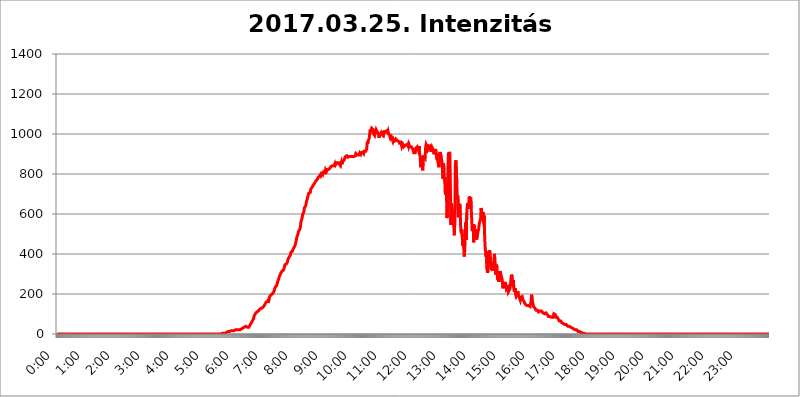
| Category | 2017.03.25. Intenzitás [W/m^2] |
|---|---|
| 0.0 | 0 |
| 0.0006944444444444445 | 0 |
| 0.001388888888888889 | 0 |
| 0.0020833333333333333 | 0 |
| 0.002777777777777778 | 0 |
| 0.003472222222222222 | 0 |
| 0.004166666666666667 | 0 |
| 0.004861111111111111 | 0 |
| 0.005555555555555556 | 0 |
| 0.0062499999999999995 | 0 |
| 0.006944444444444444 | 0 |
| 0.007638888888888889 | 0 |
| 0.008333333333333333 | 0 |
| 0.009027777777777779 | 0 |
| 0.009722222222222222 | 0 |
| 0.010416666666666666 | 0 |
| 0.011111111111111112 | 0 |
| 0.011805555555555555 | 0 |
| 0.012499999999999999 | 0 |
| 0.013194444444444444 | 0 |
| 0.013888888888888888 | 0 |
| 0.014583333333333332 | 0 |
| 0.015277777777777777 | 0 |
| 0.015972222222222224 | 0 |
| 0.016666666666666666 | 0 |
| 0.017361111111111112 | 0 |
| 0.018055555555555557 | 0 |
| 0.01875 | 0 |
| 0.019444444444444445 | 0 |
| 0.02013888888888889 | 0 |
| 0.020833333333333332 | 0 |
| 0.02152777777777778 | 0 |
| 0.022222222222222223 | 0 |
| 0.02291666666666667 | 0 |
| 0.02361111111111111 | 0 |
| 0.024305555555555556 | 0 |
| 0.024999999999999998 | 0 |
| 0.025694444444444447 | 0 |
| 0.02638888888888889 | 0 |
| 0.027083333333333334 | 0 |
| 0.027777777777777776 | 0 |
| 0.02847222222222222 | 0 |
| 0.029166666666666664 | 0 |
| 0.029861111111111113 | 0 |
| 0.030555555555555555 | 0 |
| 0.03125 | 0 |
| 0.03194444444444445 | 0 |
| 0.03263888888888889 | 0 |
| 0.03333333333333333 | 0 |
| 0.034027777777777775 | 0 |
| 0.034722222222222224 | 0 |
| 0.035416666666666666 | 0 |
| 0.036111111111111115 | 0 |
| 0.03680555555555556 | 0 |
| 0.0375 | 0 |
| 0.03819444444444444 | 0 |
| 0.03888888888888889 | 0 |
| 0.03958333333333333 | 0 |
| 0.04027777777777778 | 0 |
| 0.04097222222222222 | 0 |
| 0.041666666666666664 | 0 |
| 0.042361111111111106 | 0 |
| 0.04305555555555556 | 0 |
| 0.043750000000000004 | 0 |
| 0.044444444444444446 | 0 |
| 0.04513888888888889 | 0 |
| 0.04583333333333334 | 0 |
| 0.04652777777777778 | 0 |
| 0.04722222222222222 | 0 |
| 0.04791666666666666 | 0 |
| 0.04861111111111111 | 0 |
| 0.049305555555555554 | 0 |
| 0.049999999999999996 | 0 |
| 0.05069444444444445 | 0 |
| 0.051388888888888894 | 0 |
| 0.052083333333333336 | 0 |
| 0.05277777777777778 | 0 |
| 0.05347222222222222 | 0 |
| 0.05416666666666667 | 0 |
| 0.05486111111111111 | 0 |
| 0.05555555555555555 | 0 |
| 0.05625 | 0 |
| 0.05694444444444444 | 0 |
| 0.057638888888888885 | 0 |
| 0.05833333333333333 | 0 |
| 0.05902777777777778 | 0 |
| 0.059722222222222225 | 0 |
| 0.06041666666666667 | 0 |
| 0.061111111111111116 | 0 |
| 0.06180555555555556 | 0 |
| 0.0625 | 0 |
| 0.06319444444444444 | 0 |
| 0.06388888888888888 | 0 |
| 0.06458333333333334 | 0 |
| 0.06527777777777778 | 0 |
| 0.06597222222222222 | 0 |
| 0.06666666666666667 | 0 |
| 0.06736111111111111 | 0 |
| 0.06805555555555555 | 0 |
| 0.06874999999999999 | 0 |
| 0.06944444444444443 | 0 |
| 0.07013888888888889 | 0 |
| 0.07083333333333333 | 0 |
| 0.07152777777777779 | 0 |
| 0.07222222222222223 | 0 |
| 0.07291666666666667 | 0 |
| 0.07361111111111111 | 0 |
| 0.07430555555555556 | 0 |
| 0.075 | 0 |
| 0.07569444444444444 | 0 |
| 0.0763888888888889 | 0 |
| 0.07708333333333334 | 0 |
| 0.07777777777777778 | 0 |
| 0.07847222222222222 | 0 |
| 0.07916666666666666 | 0 |
| 0.0798611111111111 | 0 |
| 0.08055555555555556 | 0 |
| 0.08125 | 0 |
| 0.08194444444444444 | 0 |
| 0.08263888888888889 | 0 |
| 0.08333333333333333 | 0 |
| 0.08402777777777777 | 0 |
| 0.08472222222222221 | 0 |
| 0.08541666666666665 | 0 |
| 0.08611111111111112 | 0 |
| 0.08680555555555557 | 0 |
| 0.08750000000000001 | 0 |
| 0.08819444444444445 | 0 |
| 0.08888888888888889 | 0 |
| 0.08958333333333333 | 0 |
| 0.09027777777777778 | 0 |
| 0.09097222222222222 | 0 |
| 0.09166666666666667 | 0 |
| 0.09236111111111112 | 0 |
| 0.09305555555555556 | 0 |
| 0.09375 | 0 |
| 0.09444444444444444 | 0 |
| 0.09513888888888888 | 0 |
| 0.09583333333333333 | 0 |
| 0.09652777777777777 | 0 |
| 0.09722222222222222 | 0 |
| 0.09791666666666667 | 0 |
| 0.09861111111111111 | 0 |
| 0.09930555555555555 | 0 |
| 0.09999999999999999 | 0 |
| 0.10069444444444443 | 0 |
| 0.1013888888888889 | 0 |
| 0.10208333333333335 | 0 |
| 0.10277777777777779 | 0 |
| 0.10347222222222223 | 0 |
| 0.10416666666666667 | 0 |
| 0.10486111111111111 | 0 |
| 0.10555555555555556 | 0 |
| 0.10625 | 0 |
| 0.10694444444444444 | 0 |
| 0.1076388888888889 | 0 |
| 0.10833333333333334 | 0 |
| 0.10902777777777778 | 0 |
| 0.10972222222222222 | 0 |
| 0.1111111111111111 | 0 |
| 0.11180555555555556 | 0 |
| 0.11180555555555556 | 0 |
| 0.1125 | 0 |
| 0.11319444444444444 | 0 |
| 0.11388888888888889 | 0 |
| 0.11458333333333333 | 0 |
| 0.11527777777777777 | 0 |
| 0.11597222222222221 | 0 |
| 0.11666666666666665 | 0 |
| 0.1173611111111111 | 0 |
| 0.11805555555555557 | 0 |
| 0.11944444444444445 | 0 |
| 0.12013888888888889 | 0 |
| 0.12083333333333333 | 0 |
| 0.12152777777777778 | 0 |
| 0.12222222222222223 | 0 |
| 0.12291666666666667 | 0 |
| 0.12291666666666667 | 0 |
| 0.12361111111111112 | 0 |
| 0.12430555555555556 | 0 |
| 0.125 | 0 |
| 0.12569444444444444 | 0 |
| 0.12638888888888888 | 0 |
| 0.12708333333333333 | 0 |
| 0.16875 | 0 |
| 0.12847222222222224 | 0 |
| 0.12916666666666668 | 0 |
| 0.12986111111111112 | 0 |
| 0.13055555555555556 | 0 |
| 0.13125 | 0 |
| 0.13194444444444445 | 0 |
| 0.1326388888888889 | 0 |
| 0.13333333333333333 | 0 |
| 0.13402777777777777 | 0 |
| 0.13402777777777777 | 0 |
| 0.13472222222222222 | 0 |
| 0.13541666666666666 | 0 |
| 0.1361111111111111 | 0 |
| 0.13749999999999998 | 0 |
| 0.13819444444444443 | 0 |
| 0.1388888888888889 | 0 |
| 0.13958333333333334 | 0 |
| 0.14027777777777778 | 0 |
| 0.14097222222222222 | 0 |
| 0.14166666666666666 | 0 |
| 0.1423611111111111 | 0 |
| 0.14305555555555557 | 0 |
| 0.14375000000000002 | 0 |
| 0.14444444444444446 | 0 |
| 0.1451388888888889 | 0 |
| 0.1451388888888889 | 0 |
| 0.14652777777777778 | 0 |
| 0.14722222222222223 | 0 |
| 0.14791666666666667 | 0 |
| 0.1486111111111111 | 0 |
| 0.14930555555555555 | 0 |
| 0.15 | 0 |
| 0.15069444444444444 | 0 |
| 0.15138888888888888 | 0 |
| 0.15208333333333332 | 0 |
| 0.15277777777777776 | 0 |
| 0.15347222222222223 | 0 |
| 0.15416666666666667 | 0 |
| 0.15486111111111112 | 0 |
| 0.15555555555555556 | 0 |
| 0.15625 | 0 |
| 0.15694444444444444 | 0 |
| 0.15763888888888888 | 0 |
| 0.15833333333333333 | 0 |
| 0.15902777777777777 | 0 |
| 0.15972222222222224 | 0 |
| 0.16041666666666668 | 0 |
| 0.16111111111111112 | 0 |
| 0.16180555555555556 | 0 |
| 0.1625 | 0 |
| 0.16319444444444445 | 0 |
| 0.1638888888888889 | 0 |
| 0.16458333333333333 | 0 |
| 0.16527777777777777 | 0 |
| 0.16597222222222222 | 0 |
| 0.16666666666666666 | 0 |
| 0.1673611111111111 | 0 |
| 0.16805555555555554 | 0 |
| 0.16874999999999998 | 0 |
| 0.16944444444444443 | 0 |
| 0.17013888888888887 | 0 |
| 0.1708333333333333 | 0 |
| 0.17152777777777775 | 0 |
| 0.17222222222222225 | 0 |
| 0.1729166666666667 | 0 |
| 0.17361111111111113 | 0 |
| 0.17430555555555557 | 0 |
| 0.17500000000000002 | 0 |
| 0.17569444444444446 | 0 |
| 0.1763888888888889 | 0 |
| 0.17708333333333334 | 0 |
| 0.17777777777777778 | 0 |
| 0.17847222222222223 | 0 |
| 0.17916666666666667 | 0 |
| 0.1798611111111111 | 0 |
| 0.18055555555555555 | 0 |
| 0.18125 | 0 |
| 0.18194444444444444 | 0 |
| 0.1826388888888889 | 0 |
| 0.18333333333333335 | 0 |
| 0.1840277777777778 | 0 |
| 0.18472222222222223 | 0 |
| 0.18541666666666667 | 0 |
| 0.18611111111111112 | 0 |
| 0.18680555555555556 | 0 |
| 0.1875 | 0 |
| 0.18819444444444444 | 0 |
| 0.18888888888888888 | 0 |
| 0.18958333333333333 | 0 |
| 0.19027777777777777 | 0 |
| 0.1909722222222222 | 0 |
| 0.19166666666666665 | 0 |
| 0.19236111111111112 | 0 |
| 0.19305555555555554 | 0 |
| 0.19375 | 0 |
| 0.19444444444444445 | 0 |
| 0.1951388888888889 | 0 |
| 0.19583333333333333 | 0 |
| 0.19652777777777777 | 0 |
| 0.19722222222222222 | 0 |
| 0.19791666666666666 | 0 |
| 0.1986111111111111 | 0 |
| 0.19930555555555554 | 0 |
| 0.19999999999999998 | 0 |
| 0.20069444444444443 | 0 |
| 0.20138888888888887 | 0 |
| 0.2020833333333333 | 0 |
| 0.2027777777777778 | 0 |
| 0.2034722222222222 | 0 |
| 0.2041666666666667 | 0 |
| 0.20486111111111113 | 0 |
| 0.20555555555555557 | 0 |
| 0.20625000000000002 | 0 |
| 0.20694444444444446 | 0 |
| 0.2076388888888889 | 0 |
| 0.20833333333333334 | 0 |
| 0.20902777777777778 | 0 |
| 0.20972222222222223 | 0 |
| 0.21041666666666667 | 0 |
| 0.2111111111111111 | 0 |
| 0.21180555555555555 | 0 |
| 0.2125 | 0 |
| 0.21319444444444444 | 0 |
| 0.2138888888888889 | 0 |
| 0.21458333333333335 | 0 |
| 0.2152777777777778 | 0 |
| 0.21597222222222223 | 0 |
| 0.21666666666666667 | 0 |
| 0.21736111111111112 | 0 |
| 0.21805555555555556 | 0 |
| 0.21875 | 0 |
| 0.21944444444444444 | 0 |
| 0.22013888888888888 | 0 |
| 0.22083333333333333 | 0 |
| 0.22152777777777777 | 0 |
| 0.2222222222222222 | 0 |
| 0.22291666666666665 | 0 |
| 0.2236111111111111 | 0 |
| 0.22430555555555556 | 0 |
| 0.225 | 0 |
| 0.22569444444444445 | 0 |
| 0.2263888888888889 | 0 |
| 0.22708333333333333 | 0 |
| 0.22777777777777777 | 0 |
| 0.22847222222222222 | 0 |
| 0.22916666666666666 | 0 |
| 0.2298611111111111 | 0 |
| 0.23055555555555554 | 0 |
| 0.23124999999999998 | 3.525 |
| 0.23194444444444443 | 3.525 |
| 0.23263888888888887 | 3.525 |
| 0.2333333333333333 | 3.525 |
| 0.2340277777777778 | 3.525 |
| 0.2347222222222222 | 3.525 |
| 0.2354166666666667 | 3.525 |
| 0.23611111111111113 | 7.887 |
| 0.23680555555555557 | 7.887 |
| 0.23750000000000002 | 7.887 |
| 0.23819444444444446 | 12.257 |
| 0.2388888888888889 | 12.257 |
| 0.23958333333333334 | 12.257 |
| 0.24027777777777778 | 12.257 |
| 0.24097222222222223 | 12.257 |
| 0.24166666666666667 | 12.257 |
| 0.2423611111111111 | 16.636 |
| 0.24305555555555555 | 16.636 |
| 0.24375 | 16.636 |
| 0.24444444444444446 | 16.636 |
| 0.24513888888888888 | 16.636 |
| 0.24583333333333335 | 16.636 |
| 0.2465277777777778 | 16.636 |
| 0.24722222222222223 | 16.636 |
| 0.24791666666666667 | 16.636 |
| 0.24861111111111112 | 21.024 |
| 0.24930555555555556 | 21.024 |
| 0.25 | 21.024 |
| 0.25069444444444444 | 21.024 |
| 0.2513888888888889 | 21.024 |
| 0.2520833333333333 | 21.024 |
| 0.25277777777777777 | 21.024 |
| 0.2534722222222222 | 21.024 |
| 0.25416666666666665 | 21.024 |
| 0.2548611111111111 | 21.024 |
| 0.2555555555555556 | 21.024 |
| 0.25625000000000003 | 21.024 |
| 0.2569444444444445 | 21.024 |
| 0.2576388888888889 | 25.419 |
| 0.25833333333333336 | 25.419 |
| 0.2590277777777778 | 25.419 |
| 0.25972222222222224 | 25.419 |
| 0.2604166666666667 | 29.823 |
| 0.2611111111111111 | 29.823 |
| 0.26180555555555557 | 34.234 |
| 0.2625 | 34.234 |
| 0.26319444444444445 | 38.653 |
| 0.2638888888888889 | 38.653 |
| 0.26458333333333334 | 38.653 |
| 0.2652777777777778 | 34.234 |
| 0.2659722222222222 | 34.234 |
| 0.26666666666666666 | 34.234 |
| 0.2673611111111111 | 34.234 |
| 0.26805555555555555 | 34.234 |
| 0.26875 | 34.234 |
| 0.26944444444444443 | 38.653 |
| 0.2701388888888889 | 43.079 |
| 0.2708333333333333 | 47.511 |
| 0.27152777777777776 | 51.951 |
| 0.2722222222222222 | 56.398 |
| 0.27291666666666664 | 60.85 |
| 0.2736111111111111 | 60.85 |
| 0.2743055555555555 | 65.31 |
| 0.27499999999999997 | 74.246 |
| 0.27569444444444446 | 74.246 |
| 0.27638888888888885 | 92.184 |
| 0.27708333333333335 | 92.184 |
| 0.2777777777777778 | 101.184 |
| 0.27847222222222223 | 105.69 |
| 0.2791666666666667 | 105.69 |
| 0.2798611111111111 | 110.201 |
| 0.28055555555555556 | 110.201 |
| 0.28125 | 114.716 |
| 0.28194444444444444 | 114.716 |
| 0.2826388888888889 | 119.235 |
| 0.2833333333333333 | 119.235 |
| 0.28402777777777777 | 123.758 |
| 0.2847222222222222 | 123.758 |
| 0.28541666666666665 | 128.284 |
| 0.28611111111111115 | 128.284 |
| 0.28680555555555554 | 128.284 |
| 0.28750000000000003 | 132.814 |
| 0.2881944444444445 | 132.814 |
| 0.2888888888888889 | 137.347 |
| 0.28958333333333336 | 137.347 |
| 0.2902777777777778 | 141.884 |
| 0.29097222222222224 | 146.423 |
| 0.2916666666666667 | 150.964 |
| 0.2923611111111111 | 155.509 |
| 0.29305555555555557 | 160.056 |
| 0.29375 | 164.605 |
| 0.29444444444444445 | 164.605 |
| 0.2951388888888889 | 164.605 |
| 0.29583333333333334 | 155.509 |
| 0.2965277777777778 | 160.056 |
| 0.2972222222222222 | 178.264 |
| 0.29791666666666666 | 187.378 |
| 0.2986111111111111 | 187.378 |
| 0.29930555555555555 | 191.937 |
| 0.3 | 196.497 |
| 0.30069444444444443 | 196.497 |
| 0.3013888888888889 | 201.058 |
| 0.3020833333333333 | 201.058 |
| 0.30277777777777776 | 201.058 |
| 0.3034722222222222 | 205.62 |
| 0.30416666666666664 | 214.746 |
| 0.3048611111111111 | 223.873 |
| 0.3055555555555555 | 233 |
| 0.30624999999999997 | 237.564 |
| 0.3069444444444444 | 237.564 |
| 0.3076388888888889 | 242.127 |
| 0.30833333333333335 | 242.127 |
| 0.3090277777777778 | 260.373 |
| 0.30972222222222223 | 264.932 |
| 0.3104166666666667 | 274.047 |
| 0.3111111111111111 | 283.156 |
| 0.31180555555555556 | 287.709 |
| 0.3125 | 296.808 |
| 0.31319444444444444 | 296.808 |
| 0.3138888888888889 | 305.898 |
| 0.3145833333333333 | 310.44 |
| 0.31527777777777777 | 314.98 |
| 0.3159722222222222 | 314.98 |
| 0.31666666666666665 | 314.98 |
| 0.31736111111111115 | 319.517 |
| 0.31805555555555554 | 324.052 |
| 0.31875000000000003 | 337.639 |
| 0.3194444444444445 | 346.682 |
| 0.3201388888888889 | 342.162 |
| 0.32083333333333336 | 346.682 |
| 0.3215277777777778 | 351.198 |
| 0.32222222222222224 | 355.712 |
| 0.3229166666666667 | 360.221 |
| 0.3236111111111111 | 373.729 |
| 0.32430555555555557 | 373.729 |
| 0.325 | 373.729 |
| 0.32569444444444445 | 387.202 |
| 0.3263888888888889 | 387.202 |
| 0.32708333333333334 | 396.164 |
| 0.3277777777777778 | 409.574 |
| 0.3284722222222222 | 405.108 |
| 0.32916666666666666 | 409.574 |
| 0.3298611111111111 | 414.035 |
| 0.33055555555555555 | 422.943 |
| 0.33125 | 418.492 |
| 0.33194444444444443 | 431.833 |
| 0.3326388888888889 | 436.27 |
| 0.3333333333333333 | 440.702 |
| 0.3340277777777778 | 449.551 |
| 0.3347222222222222 | 453.968 |
| 0.3354166666666667 | 471.582 |
| 0.3361111111111111 | 484.735 |
| 0.3368055555555556 | 484.735 |
| 0.33749999999999997 | 497.836 |
| 0.33819444444444446 | 510.885 |
| 0.33888888888888885 | 506.542 |
| 0.33958333333333335 | 519.555 |
| 0.34027777777777773 | 523.88 |
| 0.34097222222222223 | 532.513 |
| 0.3416666666666666 | 558.261 |
| 0.3423611111111111 | 566.793 |
| 0.3430555555555555 | 575.299 |
| 0.34375 | 579.542 |
| 0.3444444444444445 | 600.661 |
| 0.3451388888888889 | 604.864 |
| 0.3458333333333334 | 609.062 |
| 0.34652777777777777 | 629.948 |
| 0.34722222222222227 | 634.105 |
| 0.34791666666666665 | 629.948 |
| 0.34861111111111115 | 642.4 |
| 0.34930555555555554 | 658.909 |
| 0.35000000000000003 | 658.909 |
| 0.3506944444444444 | 675.311 |
| 0.3513888888888889 | 687.544 |
| 0.3520833333333333 | 695.666 |
| 0.3527777777777778 | 703.762 |
| 0.3534722222222222 | 703.762 |
| 0.3541666666666667 | 707.8 |
| 0.3548611111111111 | 707.8 |
| 0.35555555555555557 | 723.889 |
| 0.35625 | 723.889 |
| 0.35694444444444445 | 727.896 |
| 0.3576388888888889 | 735.89 |
| 0.35833333333333334 | 731.896 |
| 0.3590277777777778 | 743.859 |
| 0.3597222222222222 | 747.834 |
| 0.36041666666666666 | 747.834 |
| 0.3611111111111111 | 755.766 |
| 0.36180555555555555 | 751.803 |
| 0.3625 | 759.723 |
| 0.36319444444444443 | 767.62 |
| 0.3638888888888889 | 767.62 |
| 0.3645833333333333 | 767.62 |
| 0.3652777777777778 | 775.492 |
| 0.3659722222222222 | 783.342 |
| 0.3666666666666667 | 783.342 |
| 0.3673611111111111 | 787.258 |
| 0.3680555555555556 | 791.169 |
| 0.36874999999999997 | 795.074 |
| 0.36944444444444446 | 798.974 |
| 0.37013888888888885 | 791.169 |
| 0.37083333333333335 | 791.169 |
| 0.37152777777777773 | 798.974 |
| 0.37222222222222223 | 810.641 |
| 0.3729166666666666 | 802.868 |
| 0.3736111111111111 | 810.641 |
| 0.3743055555555555 | 806.757 |
| 0.375 | 810.641 |
| 0.3756944444444445 | 806.757 |
| 0.3763888888888889 | 822.26 |
| 0.3770833333333334 | 818.392 |
| 0.37777777777777777 | 814.519 |
| 0.37847222222222227 | 822.26 |
| 0.37916666666666665 | 822.26 |
| 0.37986111111111115 | 826.123 |
| 0.38055555555555554 | 822.26 |
| 0.38125000000000003 | 818.392 |
| 0.3819444444444444 | 826.123 |
| 0.3826388888888889 | 829.981 |
| 0.3833333333333333 | 829.981 |
| 0.3840277777777778 | 837.682 |
| 0.3847222222222222 | 833.834 |
| 0.3854166666666667 | 837.682 |
| 0.3861111111111111 | 841.526 |
| 0.38680555555555557 | 845.365 |
| 0.3875 | 837.682 |
| 0.38819444444444445 | 841.526 |
| 0.3888888888888889 | 845.365 |
| 0.38958333333333334 | 853.029 |
| 0.3902777777777778 | 845.365 |
| 0.3909722222222222 | 849.199 |
| 0.39166666666666666 | 849.199 |
| 0.3923611111111111 | 856.855 |
| 0.39305555555555555 | 860.676 |
| 0.39375 | 860.676 |
| 0.39444444444444443 | 856.855 |
| 0.3951388888888889 | 853.029 |
| 0.3958333333333333 | 849.199 |
| 0.3965277777777778 | 849.199 |
| 0.3972222222222222 | 841.526 |
| 0.3979166666666667 | 853.029 |
| 0.3986111111111111 | 860.676 |
| 0.3993055555555556 | 849.199 |
| 0.39999999999999997 | 860.676 |
| 0.40069444444444446 | 860.676 |
| 0.40138888888888885 | 864.493 |
| 0.40208333333333335 | 868.305 |
| 0.40277777777777773 | 875.918 |
| 0.40347222222222223 | 875.918 |
| 0.4041666666666666 | 887.309 |
| 0.4048611111111111 | 883.516 |
| 0.4055555555555555 | 887.309 |
| 0.40625 | 891.099 |
| 0.4069444444444445 | 887.309 |
| 0.4076388888888889 | 883.516 |
| 0.4083333333333334 | 887.309 |
| 0.40902777777777777 | 887.309 |
| 0.40972222222222227 | 887.309 |
| 0.41041666666666665 | 883.516 |
| 0.41111111111111115 | 887.309 |
| 0.41180555555555554 | 887.309 |
| 0.41250000000000003 | 891.099 |
| 0.4131944444444444 | 891.099 |
| 0.4138888888888889 | 887.309 |
| 0.4145833333333333 | 891.099 |
| 0.4152777777777778 | 891.099 |
| 0.4159722222222222 | 887.309 |
| 0.4166666666666667 | 887.309 |
| 0.4173611111111111 | 883.516 |
| 0.41805555555555557 | 891.099 |
| 0.41875 | 902.447 |
| 0.41944444444444445 | 898.668 |
| 0.4201388888888889 | 902.447 |
| 0.42083333333333334 | 894.885 |
| 0.4215277777777778 | 898.668 |
| 0.4222222222222222 | 894.885 |
| 0.42291666666666666 | 894.885 |
| 0.4236111111111111 | 894.885 |
| 0.42430555555555555 | 906.223 |
| 0.425 | 909.996 |
| 0.42569444444444443 | 898.668 |
| 0.4263888888888889 | 906.223 |
| 0.4270833333333333 | 909.996 |
| 0.4277777777777778 | 909.996 |
| 0.4284722222222222 | 909.996 |
| 0.4291666666666667 | 913.766 |
| 0.4298611111111111 | 902.447 |
| 0.4305555555555556 | 913.766 |
| 0.43124999999999997 | 909.996 |
| 0.43194444444444446 | 909.996 |
| 0.43263888888888885 | 913.766 |
| 0.43333333333333335 | 909.996 |
| 0.43402777777777773 | 925.06 |
| 0.43472222222222223 | 958.814 |
| 0.4354166666666666 | 951.327 |
| 0.4361111111111111 | 966.295 |
| 0.4368055555555555 | 970.034 |
| 0.4375 | 977.508 |
| 0.4381944444444445 | 999.916 |
| 0.4388888888888889 | 1022.323 |
| 0.4395833333333334 | 1014.852 |
| 0.44027777777777777 | 1018.587 |
| 0.44097222222222227 | 1029.798 |
| 0.44166666666666665 | 1033.537 |
| 0.44236111111111115 | 1026.06 |
| 0.44305555555555554 | 1022.323 |
| 0.44375000000000003 | 999.916 |
| 0.4444444444444444 | 999.916 |
| 0.4451388888888889 | 992.448 |
| 0.4458333333333333 | 1003.65 |
| 0.4465277777777778 | 1003.65 |
| 0.4472222222222222 | 1022.323 |
| 0.4479166666666667 | 1022.323 |
| 0.4486111111111111 | 1022.323 |
| 0.44930555555555557 | 1007.383 |
| 0.45 | 1007.383 |
| 0.45069444444444445 | 996.182 |
| 0.4513888888888889 | 981.244 |
| 0.45208333333333334 | 992.448 |
| 0.4527777777777778 | 999.916 |
| 0.4534722222222222 | 1003.65 |
| 0.45416666666666666 | 1007.383 |
| 0.4548611111111111 | 999.916 |
| 0.45555555555555555 | 1003.65 |
| 0.45625 | 999.916 |
| 0.45694444444444443 | 992.448 |
| 0.4576388888888889 | 1014.852 |
| 0.4583333333333333 | 1007.383 |
| 0.4590277777777778 | 1018.587 |
| 0.4597222222222222 | 1007.383 |
| 0.4604166666666667 | 1007.383 |
| 0.4611111111111111 | 1003.65 |
| 0.4618055555555556 | 1014.852 |
| 0.46249999999999997 | 1014.852 |
| 0.46319444444444446 | 1007.383 |
| 0.46388888888888885 | 1014.852 |
| 0.46458333333333335 | 1003.65 |
| 0.46527777777777773 | 999.916 |
| 0.46597222222222223 | 996.182 |
| 0.4666666666666666 | 984.98 |
| 0.4673611111111111 | 977.508 |
| 0.4680555555555555 | 981.244 |
| 0.46875 | 984.98 |
| 0.4694444444444445 | 981.244 |
| 0.4701388888888889 | 970.034 |
| 0.4708333333333334 | 962.555 |
| 0.47152777777777777 | 970.034 |
| 0.47222222222222227 | 962.555 |
| 0.47291666666666665 | 966.295 |
| 0.47361111111111115 | 958.814 |
| 0.47430555555555554 | 966.295 |
| 0.47500000000000003 | 973.772 |
| 0.4756944444444444 | 970.034 |
| 0.4763888888888889 | 970.034 |
| 0.4770833333333333 | 966.295 |
| 0.4777777777777778 | 970.034 |
| 0.4784722222222222 | 970.034 |
| 0.4791666666666667 | 962.555 |
| 0.4798611111111111 | 955.071 |
| 0.48055555555555557 | 958.814 |
| 0.48125 | 958.814 |
| 0.48194444444444445 | 958.814 |
| 0.4826388888888889 | 947.58 |
| 0.48333333333333334 | 936.33 |
| 0.4840277777777778 | 936.33 |
| 0.4847222222222222 | 947.58 |
| 0.48541666666666666 | 947.58 |
| 0.4861111111111111 | 936.33 |
| 0.48680555555555555 | 932.576 |
| 0.4875 | 932.576 |
| 0.48819444444444443 | 943.832 |
| 0.4888888888888889 | 940.082 |
| 0.4895833333333333 | 940.082 |
| 0.4902777777777778 | 947.58 |
| 0.4909722222222222 | 947.58 |
| 0.4916666666666667 | 940.082 |
| 0.4923611111111111 | 947.58 |
| 0.4930555555555556 | 936.33 |
| 0.49374999999999997 | 943.832 |
| 0.49444444444444446 | 936.33 |
| 0.49513888888888885 | 940.082 |
| 0.49583333333333335 | 940.082 |
| 0.49652777777777773 | 936.33 |
| 0.49722222222222223 | 936.33 |
| 0.4979166666666666 | 932.576 |
| 0.4986111111111111 | 925.06 |
| 0.4993055555555555 | 917.534 |
| 0.5 | 906.223 |
| 0.5006944444444444 | 902.447 |
| 0.5013888888888889 | 906.223 |
| 0.5020833333333333 | 906.223 |
| 0.5027777777777778 | 928.819 |
| 0.5034722222222222 | 928.819 |
| 0.5041666666666667 | 928.819 |
| 0.5048611111111111 | 936.33 |
| 0.5055555555555555 | 940.082 |
| 0.50625 | 921.298 |
| 0.5069444444444444 | 921.298 |
| 0.5076388888888889 | 940.082 |
| 0.5083333333333333 | 894.885 |
| 0.5090277777777777 | 887.309 |
| 0.5097222222222222 | 833.834 |
| 0.5104166666666666 | 875.918 |
| 0.5111111111111112 | 887.309 |
| 0.5118055555555555 | 887.309 |
| 0.5125000000000001 | 818.392 |
| 0.5131944444444444 | 868.305 |
| 0.513888888888889 | 894.885 |
| 0.5145833333333333 | 887.309 |
| 0.5152777777777778 | 883.516 |
| 0.5159722222222222 | 879.719 |
| 0.5166666666666667 | 932.576 |
| 0.517361111111111 | 947.58 |
| 0.5180555555555556 | 947.58 |
| 0.5187499999999999 | 936.33 |
| 0.5194444444444445 | 947.58 |
| 0.5201388888888888 | 921.298 |
| 0.5208333333333334 | 921.298 |
| 0.5215277777777778 | 928.819 |
| 0.5222222222222223 | 932.576 |
| 0.5229166666666667 | 936.33 |
| 0.5236111111111111 | 928.819 |
| 0.5243055555555556 | 909.996 |
| 0.525 | 909.996 |
| 0.5256944444444445 | 932.576 |
| 0.5263888888888889 | 932.576 |
| 0.5270833333333333 | 921.298 |
| 0.5277777777777778 | 917.534 |
| 0.5284722222222222 | 898.668 |
| 0.5291666666666667 | 894.885 |
| 0.5298611111111111 | 917.534 |
| 0.5305555555555556 | 925.06 |
| 0.53125 | 925.06 |
| 0.5319444444444444 | 891.099 |
| 0.5326388888888889 | 872.114 |
| 0.5333333333333333 | 887.309 |
| 0.5340277777777778 | 860.676 |
| 0.5347222222222222 | 856.855 |
| 0.5354166666666667 | 833.834 |
| 0.5361111111111111 | 898.668 |
| 0.5368055555555555 | 909.996 |
| 0.5375 | 909.996 |
| 0.5381944444444444 | 891.099 |
| 0.5388888888888889 | 879.719 |
| 0.5395833333333333 | 860.676 |
| 0.5402777777777777 | 822.26 |
| 0.5409722222222222 | 775.492 |
| 0.5416666666666666 | 853.029 |
| 0.5423611111111112 | 826.123 |
| 0.5430555555555555 | 767.62 |
| 0.5437500000000001 | 783.342 |
| 0.5444444444444444 | 695.666 |
| 0.545138888888889 | 751.803 |
| 0.5458333333333333 | 719.877 |
| 0.5465277777777778 | 579.542 |
| 0.5472222222222222 | 604.864 |
| 0.5479166666666667 | 818.392 |
| 0.548611111111111 | 906.223 |
| 0.5493055555555556 | 891.099 |
| 0.5499999999999999 | 909.996 |
| 0.5506944444444445 | 902.447 |
| 0.5513888888888888 | 739.877 |
| 0.5520833333333334 | 545.416 |
| 0.5527777777777778 | 654.791 |
| 0.5534722222222223 | 634.105 |
| 0.5541666666666667 | 634.105 |
| 0.5548611111111111 | 549.704 |
| 0.5555555555555556 | 621.613 |
| 0.55625 | 536.82 |
| 0.5569444444444445 | 493.475 |
| 0.5576388888888889 | 583.779 |
| 0.5583333333333333 | 845.365 |
| 0.5590277777777778 | 868.305 |
| 0.5597222222222222 | 868.305 |
| 0.5604166666666667 | 755.766 |
| 0.5611111111111111 | 671.22 |
| 0.5618055555555556 | 691.608 |
| 0.5625 | 583.779 |
| 0.5631944444444444 | 600.661 |
| 0.5638888888888889 | 613.252 |
| 0.5645833333333333 | 650.667 |
| 0.5652777777777778 | 592.233 |
| 0.5659722222222222 | 519.555 |
| 0.5666666666666667 | 506.542 |
| 0.5673611111111111 | 523.88 |
| 0.5680555555555555 | 484.735 |
| 0.56875 | 440.702 |
| 0.5694444444444444 | 471.582 |
| 0.5701388888888889 | 431.833 |
| 0.5708333333333333 | 387.202 |
| 0.5715277777777777 | 418.492 |
| 0.5722222222222222 | 489.108 |
| 0.5729166666666666 | 558.261 |
| 0.5736111111111112 | 471.582 |
| 0.5743055555555555 | 596.45 |
| 0.5750000000000001 | 638.256 |
| 0.5756944444444444 | 654.791 |
| 0.576388888888889 | 625.784 |
| 0.5770833333333333 | 650.667 |
| 0.5777777777777778 | 687.544 |
| 0.5784722222222222 | 683.473 |
| 0.5791666666666667 | 675.311 |
| 0.579861111111111 | 683.473 |
| 0.5805555555555556 | 634.105 |
| 0.5812499999999999 | 575.299 |
| 0.5819444444444445 | 515.223 |
| 0.5826388888888888 | 523.88 |
| 0.5833333333333334 | 549.704 |
| 0.5840277777777778 | 458.38 |
| 0.5847222222222223 | 545.416 |
| 0.5854166666666667 | 489.108 |
| 0.5861111111111111 | 523.88 |
| 0.5868055555555556 | 515.223 |
| 0.5875 | 489.108 |
| 0.5881944444444445 | 471.582 |
| 0.5888888888888889 | 467.187 |
| 0.5895833333333333 | 502.192 |
| 0.5902777777777778 | 515.223 |
| 0.5909722222222222 | 523.88 |
| 0.5916666666666667 | 545.416 |
| 0.5923611111111111 | 558.261 |
| 0.5930555555555556 | 553.986 |
| 0.59375 | 575.299 |
| 0.5944444444444444 | 629.948 |
| 0.5951388888888889 | 617.436 |
| 0.5958333333333333 | 621.613 |
| 0.5965277777777778 | 566.793 |
| 0.5972222222222222 | 609.062 |
| 0.5979166666666667 | 553.986 |
| 0.5986111111111111 | 592.233 |
| 0.5993055555555555 | 506.542 |
| 0.6 | 440.702 |
| 0.6006944444444444 | 440.702 |
| 0.6013888888888889 | 387.202 |
| 0.6020833333333333 | 414.035 |
| 0.6027777777777777 | 324.052 |
| 0.6034722222222222 | 305.898 |
| 0.6041666666666666 | 314.98 |
| 0.6048611111111112 | 369.23 |
| 0.6055555555555555 | 382.715 |
| 0.6062500000000001 | 418.492 |
| 0.6069444444444444 | 409.574 |
| 0.607638888888889 | 378.224 |
| 0.6083333333333333 | 333.113 |
| 0.6090277777777778 | 319.517 |
| 0.6097222222222222 | 355.712 |
| 0.6104166666666667 | 360.221 |
| 0.611111111111111 | 314.98 |
| 0.6118055555555556 | 337.639 |
| 0.6124999999999999 | 333.113 |
| 0.6131944444444445 | 400.638 |
| 0.6138888888888888 | 351.198 |
| 0.6145833333333334 | 314.98 |
| 0.6152777777777778 | 296.808 |
| 0.6159722222222223 | 346.682 |
| 0.6166666666666667 | 337.639 |
| 0.6173611111111111 | 287.709 |
| 0.6180555555555556 | 269.49 |
| 0.61875 | 305.898 |
| 0.6194444444444445 | 260.373 |
| 0.6201388888888889 | 287.709 |
| 0.6208333333333333 | 314.98 |
| 0.6215277777777778 | 296.808 |
| 0.6222222222222222 | 278.603 |
| 0.6229166666666667 | 287.709 |
| 0.6236111111111111 | 278.603 |
| 0.6243055555555556 | 264.932 |
| 0.625 | 228.436 |
| 0.6256944444444444 | 233 |
| 0.6263888888888889 | 255.813 |
| 0.6270833333333333 | 233 |
| 0.6277777777777778 | 237.564 |
| 0.6284722222222222 | 260.373 |
| 0.6291666666666667 | 242.127 |
| 0.6298611111111111 | 223.873 |
| 0.6305555555555555 | 219.309 |
| 0.63125 | 223.873 |
| 0.6319444444444444 | 233 |
| 0.6326388888888889 | 210.182 |
| 0.6333333333333333 | 205.62 |
| 0.6340277777777777 | 214.746 |
| 0.6347222222222222 | 223.873 |
| 0.6354166666666666 | 237.564 |
| 0.6361111111111112 | 264.932 |
| 0.6368055555555555 | 287.709 |
| 0.6375000000000001 | 296.808 |
| 0.6381944444444444 | 260.373 |
| 0.638888888888889 | 242.127 |
| 0.6395833333333333 | 269.49 |
| 0.6402777777777778 | 233 |
| 0.6409722222222222 | 210.182 |
| 0.6416666666666667 | 214.746 |
| 0.642361111111111 | 228.436 |
| 0.6430555555555556 | 196.497 |
| 0.6437499999999999 | 187.378 |
| 0.6444444444444445 | 182.82 |
| 0.6451388888888888 | 196.497 |
| 0.6458333333333334 | 214.746 |
| 0.6465277777777778 | 201.058 |
| 0.6472222222222223 | 205.62 |
| 0.6479166666666667 | 182.82 |
| 0.6486111111111111 | 178.264 |
| 0.6493055555555556 | 169.156 |
| 0.65 | 182.82 |
| 0.6506944444444445 | 178.264 |
| 0.6513888888888889 | 178.264 |
| 0.6520833333333333 | 187.378 |
| 0.6527777777777778 | 173.709 |
| 0.6534722222222222 | 169.156 |
| 0.6541666666666667 | 164.605 |
| 0.6548611111111111 | 164.605 |
| 0.6555555555555556 | 155.509 |
| 0.65625 | 150.964 |
| 0.6569444444444444 | 146.423 |
| 0.6576388888888889 | 146.423 |
| 0.6583333333333333 | 146.423 |
| 0.6590277777777778 | 141.884 |
| 0.6597222222222222 | 141.884 |
| 0.6604166666666667 | 141.884 |
| 0.6611111111111111 | 141.884 |
| 0.6618055555555555 | 146.423 |
| 0.6625 | 146.423 |
| 0.6631944444444444 | 137.347 |
| 0.6638888888888889 | 141.884 |
| 0.6645833333333333 | 164.605 |
| 0.6652777777777777 | 196.497 |
| 0.6659722222222222 | 178.264 |
| 0.6666666666666666 | 160.056 |
| 0.6673611111111111 | 155.509 |
| 0.6680555555555556 | 137.347 |
| 0.6687500000000001 | 137.347 |
| 0.6694444444444444 | 141.884 |
| 0.6701388888888888 | 128.284 |
| 0.6708333333333334 | 123.758 |
| 0.6715277777777778 | 119.235 |
| 0.6722222222222222 | 119.235 |
| 0.6729166666666666 | 119.235 |
| 0.6736111111111112 | 119.235 |
| 0.6743055555555556 | 114.716 |
| 0.6749999999999999 | 110.201 |
| 0.6756944444444444 | 114.716 |
| 0.6763888888888889 | 114.716 |
| 0.6770833333333334 | 114.716 |
| 0.6777777777777777 | 114.716 |
| 0.6784722222222223 | 119.235 |
| 0.6791666666666667 | 114.716 |
| 0.6798611111111111 | 110.201 |
| 0.6805555555555555 | 110.201 |
| 0.68125 | 105.69 |
| 0.6819444444444445 | 101.184 |
| 0.6826388888888889 | 101.184 |
| 0.6833333333333332 | 101.184 |
| 0.6840277777777778 | 101.184 |
| 0.6847222222222222 | 101.184 |
| 0.6854166666666667 | 105.69 |
| 0.686111111111111 | 101.184 |
| 0.6868055555555556 | 101.184 |
| 0.6875 | 96.682 |
| 0.6881944444444444 | 92.184 |
| 0.688888888888889 | 87.692 |
| 0.6895833333333333 | 87.692 |
| 0.6902777777777778 | 83.205 |
| 0.6909722222222222 | 87.692 |
| 0.6916666666666668 | 83.205 |
| 0.6923611111111111 | 83.205 |
| 0.6930555555555555 | 83.205 |
| 0.69375 | 83.205 |
| 0.6944444444444445 | 83.205 |
| 0.6951388888888889 | 83.205 |
| 0.6958333333333333 | 87.692 |
| 0.6965277777777777 | 101.184 |
| 0.6972222222222223 | 105.69 |
| 0.6979166666666666 | 101.184 |
| 0.6986111111111111 | 96.682 |
| 0.6993055555555556 | 83.205 |
| 0.7000000000000001 | 78.722 |
| 0.7006944444444444 | 78.722 |
| 0.7013888888888888 | 83.205 |
| 0.7020833333333334 | 78.722 |
| 0.7027777777777778 | 74.246 |
| 0.7034722222222222 | 69.775 |
| 0.7041666666666666 | 65.31 |
| 0.7048611111111112 | 65.31 |
| 0.7055555555555556 | 65.31 |
| 0.7062499999999999 | 65.31 |
| 0.7069444444444444 | 60.85 |
| 0.7076388888888889 | 56.398 |
| 0.7083333333333334 | 56.398 |
| 0.7090277777777777 | 51.951 |
| 0.7097222222222223 | 51.951 |
| 0.7104166666666667 | 47.511 |
| 0.7111111111111111 | 47.511 |
| 0.7118055555555555 | 47.511 |
| 0.7125 | 47.511 |
| 0.7131944444444445 | 47.511 |
| 0.7138888888888889 | 47.511 |
| 0.7145833333333332 | 43.079 |
| 0.7152777777777778 | 43.079 |
| 0.7159722222222222 | 38.653 |
| 0.7166666666666667 | 38.653 |
| 0.717361111111111 | 38.653 |
| 0.7180555555555556 | 38.653 |
| 0.71875 | 38.653 |
| 0.7194444444444444 | 38.653 |
| 0.720138888888889 | 34.234 |
| 0.7208333333333333 | 34.234 |
| 0.7215277777777778 | 29.823 |
| 0.7222222222222222 | 29.823 |
| 0.7229166666666668 | 29.823 |
| 0.7236111111111111 | 29.823 |
| 0.7243055555555555 | 25.419 |
| 0.725 | 25.419 |
| 0.7256944444444445 | 25.419 |
| 0.7263888888888889 | 21.024 |
| 0.7270833333333333 | 21.024 |
| 0.7277777777777777 | 21.024 |
| 0.7284722222222223 | 21.024 |
| 0.7291666666666666 | 16.636 |
| 0.7298611111111111 | 16.636 |
| 0.7305555555555556 | 12.257 |
| 0.7312500000000001 | 12.257 |
| 0.7319444444444444 | 12.257 |
| 0.7326388888888888 | 12.257 |
| 0.7333333333333334 | 12.257 |
| 0.7340277777777778 | 7.887 |
| 0.7347222222222222 | 7.887 |
| 0.7354166666666666 | 7.887 |
| 0.7361111111111112 | 3.525 |
| 0.7368055555555556 | 3.525 |
| 0.7374999999999999 | 3.525 |
| 0.7381944444444444 | 3.525 |
| 0.7388888888888889 | 3.525 |
| 0.7395833333333334 | 3.525 |
| 0.7402777777777777 | 3.525 |
| 0.7409722222222223 | 0 |
| 0.7416666666666667 | 0 |
| 0.7423611111111111 | 0 |
| 0.7430555555555555 | 0 |
| 0.74375 | 0 |
| 0.7444444444444445 | 0 |
| 0.7451388888888889 | 0 |
| 0.7458333333333332 | 0 |
| 0.7465277777777778 | 0 |
| 0.7472222222222222 | 0 |
| 0.7479166666666667 | 0 |
| 0.748611111111111 | 0 |
| 0.7493055555555556 | 0 |
| 0.75 | 0 |
| 0.7506944444444444 | 0 |
| 0.751388888888889 | 0 |
| 0.7520833333333333 | 0 |
| 0.7527777777777778 | 0 |
| 0.7534722222222222 | 0 |
| 0.7541666666666668 | 0 |
| 0.7548611111111111 | 0 |
| 0.7555555555555555 | 0 |
| 0.75625 | 0 |
| 0.7569444444444445 | 0 |
| 0.7576388888888889 | 0 |
| 0.7583333333333333 | 0 |
| 0.7590277777777777 | 0 |
| 0.7597222222222223 | 0 |
| 0.7604166666666666 | 0 |
| 0.7611111111111111 | 0 |
| 0.7618055555555556 | 0 |
| 0.7625000000000001 | 0 |
| 0.7631944444444444 | 0 |
| 0.7638888888888888 | 0 |
| 0.7645833333333334 | 0 |
| 0.7652777777777778 | 0 |
| 0.7659722222222222 | 0 |
| 0.7666666666666666 | 0 |
| 0.7673611111111112 | 0 |
| 0.7680555555555556 | 0 |
| 0.7687499999999999 | 0 |
| 0.7694444444444444 | 0 |
| 0.7701388888888889 | 0 |
| 0.7708333333333334 | 0 |
| 0.7715277777777777 | 0 |
| 0.7722222222222223 | 0 |
| 0.7729166666666667 | 0 |
| 0.7736111111111111 | 0 |
| 0.7743055555555555 | 0 |
| 0.775 | 0 |
| 0.7756944444444445 | 0 |
| 0.7763888888888889 | 0 |
| 0.7770833333333332 | 0 |
| 0.7777777777777778 | 0 |
| 0.7784722222222222 | 0 |
| 0.7791666666666667 | 0 |
| 0.779861111111111 | 0 |
| 0.7805555555555556 | 0 |
| 0.78125 | 0 |
| 0.7819444444444444 | 0 |
| 0.782638888888889 | 0 |
| 0.7833333333333333 | 0 |
| 0.7840277777777778 | 0 |
| 0.7847222222222222 | 0 |
| 0.7854166666666668 | 0 |
| 0.7861111111111111 | 0 |
| 0.7868055555555555 | 0 |
| 0.7875 | 0 |
| 0.7881944444444445 | 0 |
| 0.7888888888888889 | 0 |
| 0.7895833333333333 | 0 |
| 0.7902777777777777 | 0 |
| 0.7909722222222223 | 0 |
| 0.7916666666666666 | 0 |
| 0.7923611111111111 | 0 |
| 0.7930555555555556 | 0 |
| 0.7937500000000001 | 0 |
| 0.7944444444444444 | 0 |
| 0.7951388888888888 | 0 |
| 0.7958333333333334 | 0 |
| 0.7965277777777778 | 0 |
| 0.7972222222222222 | 0 |
| 0.7979166666666666 | 0 |
| 0.7986111111111112 | 0 |
| 0.7993055555555556 | 0 |
| 0.7999999999999999 | 0 |
| 0.8006944444444444 | 0 |
| 0.8013888888888889 | 0 |
| 0.8020833333333334 | 0 |
| 0.8027777777777777 | 0 |
| 0.8034722222222223 | 0 |
| 0.8041666666666667 | 0 |
| 0.8048611111111111 | 0 |
| 0.8055555555555555 | 0 |
| 0.80625 | 0 |
| 0.8069444444444445 | 0 |
| 0.8076388888888889 | 0 |
| 0.8083333333333332 | 0 |
| 0.8090277777777778 | 0 |
| 0.8097222222222222 | 0 |
| 0.8104166666666667 | 0 |
| 0.811111111111111 | 0 |
| 0.8118055555555556 | 0 |
| 0.8125 | 0 |
| 0.8131944444444444 | 0 |
| 0.813888888888889 | 0 |
| 0.8145833333333333 | 0 |
| 0.8152777777777778 | 0 |
| 0.8159722222222222 | 0 |
| 0.8166666666666668 | 0 |
| 0.8173611111111111 | 0 |
| 0.8180555555555555 | 0 |
| 0.81875 | 0 |
| 0.8194444444444445 | 0 |
| 0.8201388888888889 | 0 |
| 0.8208333333333333 | 0 |
| 0.8215277777777777 | 0 |
| 0.8222222222222223 | 0 |
| 0.8229166666666666 | 0 |
| 0.8236111111111111 | 0 |
| 0.8243055555555556 | 0 |
| 0.8250000000000001 | 0 |
| 0.8256944444444444 | 0 |
| 0.8263888888888888 | 0 |
| 0.8270833333333334 | 0 |
| 0.8277777777777778 | 0 |
| 0.8284722222222222 | 0 |
| 0.8291666666666666 | 0 |
| 0.8298611111111112 | 0 |
| 0.8305555555555556 | 0 |
| 0.8312499999999999 | 0 |
| 0.8319444444444444 | 0 |
| 0.8326388888888889 | 0 |
| 0.8333333333333334 | 0 |
| 0.8340277777777777 | 0 |
| 0.8347222222222223 | 0 |
| 0.8354166666666667 | 0 |
| 0.8361111111111111 | 0 |
| 0.8368055555555555 | 0 |
| 0.8375 | 0 |
| 0.8381944444444445 | 0 |
| 0.8388888888888889 | 0 |
| 0.8395833333333332 | 0 |
| 0.8402777777777778 | 0 |
| 0.8409722222222222 | 0 |
| 0.8416666666666667 | 0 |
| 0.842361111111111 | 0 |
| 0.8430555555555556 | 0 |
| 0.84375 | 0 |
| 0.8444444444444444 | 0 |
| 0.845138888888889 | 0 |
| 0.8458333333333333 | 0 |
| 0.8465277777777778 | 0 |
| 0.8472222222222222 | 0 |
| 0.8479166666666668 | 0 |
| 0.8486111111111111 | 0 |
| 0.8493055555555555 | 0 |
| 0.85 | 0 |
| 0.8506944444444445 | 0 |
| 0.8513888888888889 | 0 |
| 0.8520833333333333 | 0 |
| 0.8527777777777777 | 0 |
| 0.8534722222222223 | 0 |
| 0.8541666666666666 | 0 |
| 0.8548611111111111 | 0 |
| 0.8555555555555556 | 0 |
| 0.8562500000000001 | 0 |
| 0.8569444444444444 | 0 |
| 0.8576388888888888 | 0 |
| 0.8583333333333334 | 0 |
| 0.8590277777777778 | 0 |
| 0.8597222222222222 | 0 |
| 0.8604166666666666 | 0 |
| 0.8611111111111112 | 0 |
| 0.8618055555555556 | 0 |
| 0.8624999999999999 | 0 |
| 0.8631944444444444 | 0 |
| 0.8638888888888889 | 0 |
| 0.8645833333333334 | 0 |
| 0.8652777777777777 | 0 |
| 0.8659722222222223 | 0 |
| 0.8666666666666667 | 0 |
| 0.8673611111111111 | 0 |
| 0.8680555555555555 | 0 |
| 0.86875 | 0 |
| 0.8694444444444445 | 0 |
| 0.8701388888888889 | 0 |
| 0.8708333333333332 | 0 |
| 0.8715277777777778 | 0 |
| 0.8722222222222222 | 0 |
| 0.8729166666666667 | 0 |
| 0.873611111111111 | 0 |
| 0.8743055555555556 | 0 |
| 0.875 | 0 |
| 0.8756944444444444 | 0 |
| 0.876388888888889 | 0 |
| 0.8770833333333333 | 0 |
| 0.8777777777777778 | 0 |
| 0.8784722222222222 | 0 |
| 0.8791666666666668 | 0 |
| 0.8798611111111111 | 0 |
| 0.8805555555555555 | 0 |
| 0.88125 | 0 |
| 0.8819444444444445 | 0 |
| 0.8826388888888889 | 0 |
| 0.8833333333333333 | 0 |
| 0.8840277777777777 | 0 |
| 0.8847222222222223 | 0 |
| 0.8854166666666666 | 0 |
| 0.8861111111111111 | 0 |
| 0.8868055555555556 | 0 |
| 0.8875000000000001 | 0 |
| 0.8881944444444444 | 0 |
| 0.8888888888888888 | 0 |
| 0.8895833333333334 | 0 |
| 0.8902777777777778 | 0 |
| 0.8909722222222222 | 0 |
| 0.8916666666666666 | 0 |
| 0.8923611111111112 | 0 |
| 0.8930555555555556 | 0 |
| 0.8937499999999999 | 0 |
| 0.8944444444444444 | 0 |
| 0.8951388888888889 | 0 |
| 0.8958333333333334 | 0 |
| 0.8965277777777777 | 0 |
| 0.8972222222222223 | 0 |
| 0.8979166666666667 | 0 |
| 0.8986111111111111 | 0 |
| 0.8993055555555555 | 0 |
| 0.9 | 0 |
| 0.9006944444444445 | 0 |
| 0.9013888888888889 | 0 |
| 0.9020833333333332 | 0 |
| 0.9027777777777778 | 0 |
| 0.9034722222222222 | 0 |
| 0.9041666666666667 | 0 |
| 0.904861111111111 | 0 |
| 0.9055555555555556 | 0 |
| 0.90625 | 0 |
| 0.9069444444444444 | 0 |
| 0.907638888888889 | 0 |
| 0.9083333333333333 | 0 |
| 0.9090277777777778 | 0 |
| 0.9097222222222222 | 0 |
| 0.9104166666666668 | 0 |
| 0.9111111111111111 | 0 |
| 0.9118055555555555 | 0 |
| 0.9125 | 0 |
| 0.9131944444444445 | 0 |
| 0.9138888888888889 | 0 |
| 0.9145833333333333 | 0 |
| 0.9152777777777777 | 0 |
| 0.9159722222222223 | 0 |
| 0.9166666666666666 | 0 |
| 0.9173611111111111 | 0 |
| 0.9180555555555556 | 0 |
| 0.9187500000000001 | 0 |
| 0.9194444444444444 | 0 |
| 0.9201388888888888 | 0 |
| 0.9208333333333334 | 0 |
| 0.9215277777777778 | 0 |
| 0.9222222222222222 | 0 |
| 0.9229166666666666 | 0 |
| 0.9236111111111112 | 0 |
| 0.9243055555555556 | 0 |
| 0.9249999999999999 | 0 |
| 0.9256944444444444 | 0 |
| 0.9263888888888889 | 0 |
| 0.9270833333333334 | 0 |
| 0.9277777777777777 | 0 |
| 0.9284722222222223 | 0 |
| 0.9291666666666667 | 0 |
| 0.9298611111111111 | 0 |
| 0.9305555555555555 | 0 |
| 0.93125 | 0 |
| 0.9319444444444445 | 0 |
| 0.9326388888888889 | 0 |
| 0.9333333333333332 | 0 |
| 0.9340277777777778 | 0 |
| 0.9347222222222222 | 0 |
| 0.9354166666666667 | 0 |
| 0.936111111111111 | 0 |
| 0.9368055555555556 | 0 |
| 0.9375 | 0 |
| 0.9381944444444444 | 0 |
| 0.938888888888889 | 0 |
| 0.9395833333333333 | 0 |
| 0.9402777777777778 | 0 |
| 0.9409722222222222 | 0 |
| 0.9416666666666668 | 0 |
| 0.9423611111111111 | 0 |
| 0.9430555555555555 | 0 |
| 0.94375 | 0 |
| 0.9444444444444445 | 0 |
| 0.9451388888888889 | 0 |
| 0.9458333333333333 | 0 |
| 0.9465277777777777 | 0 |
| 0.9472222222222223 | 0 |
| 0.9479166666666666 | 0 |
| 0.9486111111111111 | 0 |
| 0.9493055555555556 | 0 |
| 0.9500000000000001 | 0 |
| 0.9506944444444444 | 0 |
| 0.9513888888888888 | 0 |
| 0.9520833333333334 | 0 |
| 0.9527777777777778 | 0 |
| 0.9534722222222222 | 0 |
| 0.9541666666666666 | 0 |
| 0.9548611111111112 | 0 |
| 0.9555555555555556 | 0 |
| 0.9562499999999999 | 0 |
| 0.9569444444444444 | 0 |
| 0.9576388888888889 | 0 |
| 0.9583333333333334 | 0 |
| 0.9590277777777777 | 0 |
| 0.9597222222222223 | 0 |
| 0.9604166666666667 | 0 |
| 0.9611111111111111 | 0 |
| 0.9618055555555555 | 0 |
| 0.9625 | 0 |
| 0.9631944444444445 | 0 |
| 0.9638888888888889 | 0 |
| 0.9645833333333332 | 0 |
| 0.9652777777777778 | 0 |
| 0.9659722222222222 | 0 |
| 0.9666666666666667 | 0 |
| 0.967361111111111 | 0 |
| 0.9680555555555556 | 0 |
| 0.96875 | 0 |
| 0.9694444444444444 | 0 |
| 0.970138888888889 | 0 |
| 0.9708333333333333 | 0 |
| 0.9715277777777778 | 0 |
| 0.9722222222222222 | 0 |
| 0.9729166666666668 | 0 |
| 0.9736111111111111 | 0 |
| 0.9743055555555555 | 0 |
| 0.975 | 0 |
| 0.9756944444444445 | 0 |
| 0.9763888888888889 | 0 |
| 0.9770833333333333 | 0 |
| 0.9777777777777777 | 0 |
| 0.9784722222222223 | 0 |
| 0.9791666666666666 | 0 |
| 0.9798611111111111 | 0 |
| 0.9805555555555556 | 0 |
| 0.9812500000000001 | 0 |
| 0.9819444444444444 | 0 |
| 0.9826388888888888 | 0 |
| 0.9833333333333334 | 0 |
| 0.9840277777777778 | 0 |
| 0.9847222222222222 | 0 |
| 0.9854166666666666 | 0 |
| 0.9861111111111112 | 0 |
| 0.9868055555555556 | 0 |
| 0.9874999999999999 | 0 |
| 0.9881944444444444 | 0 |
| 0.9888888888888889 | 0 |
| 0.9895833333333334 | 0 |
| 0.9902777777777777 | 0 |
| 0.9909722222222223 | 0 |
| 0.9916666666666667 | 0 |
| 0.9923611111111111 | 0 |
| 0.9930555555555555 | 0 |
| 0.99375 | 0 |
| 0.9944444444444445 | 0 |
| 0.9951388888888889 | 0 |
| 0.9958333333333332 | 0 |
| 0.9965277777777778 | 0 |
| 0.9972222222222222 | 0 |
| 0.9979166666666667 | 0 |
| 0.998611111111111 | 0 |
| 0.9993055555555556 | 0 |